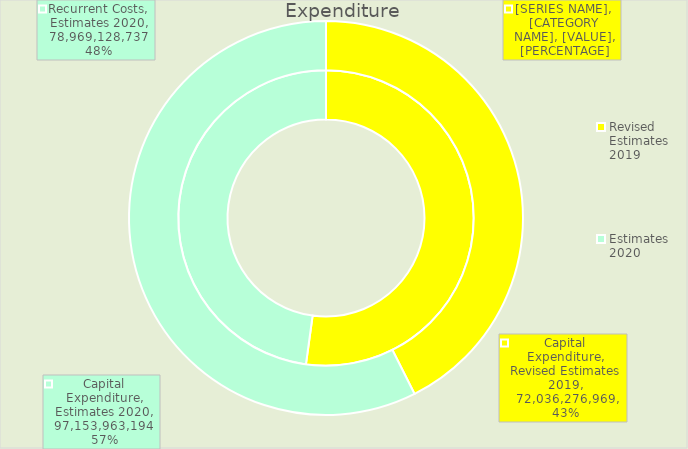
| Category | Recurrent Costs | Capital Expenditure |
|---|---|---|
| Revised Estimates 2019 | 86135784002 | 72036276969 |
| Estimates 2020 | 78969128737.498 | 97153963194 |